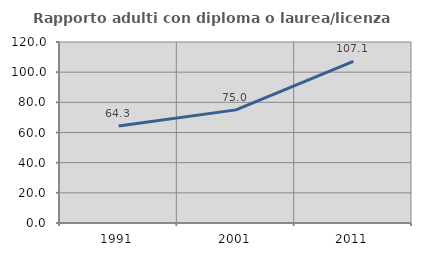
| Category | Rapporto adulti con diploma o laurea/licenza media  |
|---|---|
| 1991.0 | 64.345 |
| 2001.0 | 75 |
| 2011.0 | 107.129 |